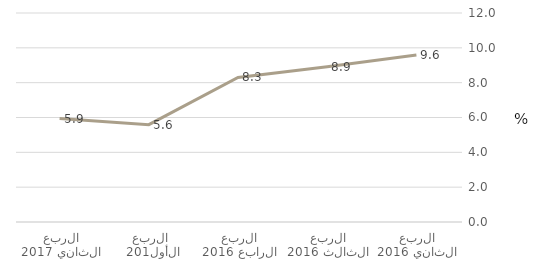
| Category | أنشطة الأسر المعيشية كصاحب عمل |
|---|---|
| الربع الثاني 2016 | 9.583 |
| الربع الثالث 2016 | 8.916 |
| الربع الرابع 2016 | 8.299 |
| الربع الأول 2017 | 5.587 |
| الربع الثاني 2017 | 5.936 |